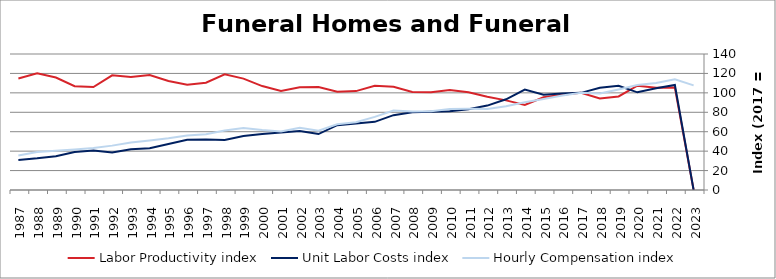
| Category | Labor Productivity index | Unit Labor Costs index | Hourly Compensation index |
|---|---|---|---|
| 2023.0 | 0 | 0 | 107.752 |
| 2022.0 | 105.473 | 108.123 | 114.04 |
| 2021.0 | 105.336 | 104.639 | 110.223 |
| 2020.0 | 107.394 | 100.545 | 107.979 |
| 2019.0 | 96.345 | 107.346 | 103.422 |
| 2018.0 | 94.292 | 105.311 | 99.3 |
| 2017.0 | 100 | 100 | 100 |
| 2016.0 | 98.003 | 99.257 | 97.275 |
| 2015.0 | 95.516 | 98.126 | 93.727 |
| 2014.0 | 87.512 | 103.305 | 90.404 |
| 2013.0 | 92.276 | 93.348 | 86.138 |
| 2012.0 | 96.043 | 86.897 | 83.458 |
| 2011.0 | 100.619 | 83.111 | 83.625 |
| 2010.0 | 102.807 | 81.137 | 83.415 |
| 2009.0 | 100.572 | 80.638 | 81.1 |
| 2008.0 | 100.933 | 80.022 | 80.769 |
| 2007.0 | 106.286 | 77.062 | 81.906 |
| 2006.0 | 107.301 | 70.144 | 75.265 |
| 2005.0 | 101.803 | 68.439 | 69.673 |
| 2004.0 | 101.26 | 66.759 | 67.601 |
| 2003.0 | 106.001 | 57.586 | 61.042 |
| 2002.0 | 105.655 | 60.677 | 64.108 |
| 2001.0 | 101.844 | 59.25 | 60.342 |
| 2000.0 | 106.973 | 57.635 | 61.654 |
| 1999.0 | 114.664 | 55.604 | 63.758 |
| 1998.0 | 119.065 | 51.385 | 61.181 |
| 1997.0 | 110.382 | 52.087 | 57.495 |
| 1996.0 | 108.29 | 51.753 | 56.043 |
| 1995.0 | 112.276 | 47.384 | 53.201 |
| 1994.0 | 118.348 | 43.066 | 50.967 |
| 1993.0 | 116.328 | 42.059 | 48.927 |
| 1992.0 | 118.026 | 38.707 | 45.684 |
| 1991.0 | 106.008 | 40.712 | 43.158 |
| 1990.0 | 106.875 | 39.06 | 41.746 |
| 1989.0 | 115.81 | 34.786 | 40.285 |
| 1988.0 | 120.207 | 32.563 | 39.143 |
| 1987.0 | 114.83 | 30.959 | 35.55 |